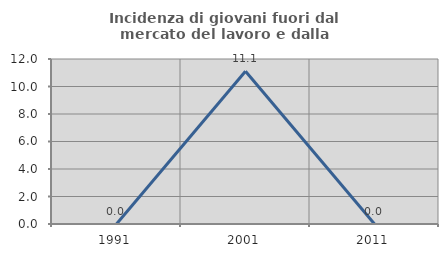
| Category | Incidenza di giovani fuori dal mercato del lavoro e dalla formazione  |
|---|---|
| 1991.0 | 0 |
| 2001.0 | 11.111 |
| 2011.0 | 0 |